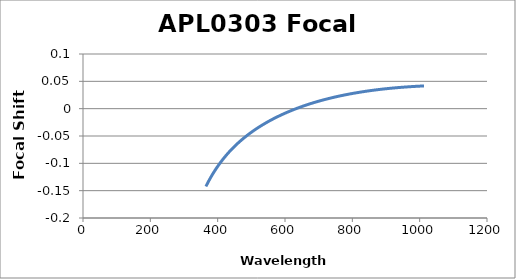
| Category | Focal Shift (mm) |
|---|---|
| 365.0 | -0.142 |
| 366.0 | -0.141 |
| 367.0 | -0.14 |
| 368.0 | -0.139 |
| 369.0 | -0.137 |
| 370.0 | -0.136 |
| 371.0 | -0.135 |
| 372.0 | -0.134 |
| 373.0 | -0.133 |
| 374.0 | -0.132 |
| 375.0 | -0.131 |
| 376.0 | -0.129 |
| 377.0 | -0.128 |
| 378.0 | -0.127 |
| 379.0 | -0.126 |
| 380.0 | -0.125 |
| 381.0 | -0.124 |
| 382.0 | -0.123 |
| 383.0 | -0.122 |
| 384.0 | -0.121 |
| 385.0 | -0.12 |
| 386.0 | -0.119 |
| 387.0 | -0.118 |
| 388.0 | -0.117 |
| 389.0 | -0.116 |
| 390.0 | -0.115 |
| 391.0 | -0.114 |
| 392.0 | -0.113 |
| 393.0 | -0.112 |
| 394.0 | -0.111 |
| 395.0 | -0.11 |
| 396.0 | -0.109 |
| 397.0 | -0.108 |
| 398.0 | -0.107 |
| 399.0 | -0.107 |
| 400.0 | -0.106 |
| 401.0 | -0.105 |
| 402.0 | -0.104 |
| 403.0 | -0.103 |
| 404.0 | -0.102 |
| 405.0 | -0.101 |
| 406.0 | -0.1 |
| 407.0 | -0.1 |
| 408.0 | -0.099 |
| 409.0 | -0.098 |
| 410.0 | -0.097 |
| 411.0 | -0.096 |
| 412.0 | -0.095 |
| 413.0 | -0.095 |
| 414.0 | -0.094 |
| 415.0 | -0.093 |
| 416.0 | -0.092 |
| 417.0 | -0.092 |
| 418.0 | -0.091 |
| 419.0 | -0.09 |
| 420.0 | -0.089 |
| 421.0 | -0.089 |
| 422.0 | -0.088 |
| 423.0 | -0.087 |
| 424.0 | -0.086 |
| 425.0 | -0.086 |
| 426.0 | -0.085 |
| 427.0 | -0.084 |
| 428.0 | -0.083 |
| 429.0 | -0.083 |
| 430.0 | -0.082 |
| 431.0 | -0.081 |
| 432.0 | -0.081 |
| 433.0 | -0.08 |
| 434.0 | -0.079 |
| 435.0 | -0.079 |
| 436.0 | -0.078 |
| 437.0 | -0.077 |
| 438.0 | -0.077 |
| 439.0 | -0.076 |
| 440.0 | -0.075 |
| 441.0 | -0.075 |
| 442.0 | -0.074 |
| 443.0 | -0.073 |
| 444.0 | -0.073 |
| 445.0 | -0.072 |
| 446.0 | -0.072 |
| 447.0 | -0.071 |
| 448.0 | -0.07 |
| 449.0 | -0.07 |
| 450.0 | -0.069 |
| 451.0 | -0.068 |
| 452.0 | -0.068 |
| 453.0 | -0.067 |
| 454.0 | -0.067 |
| 455.0 | -0.066 |
| 456.0 | -0.066 |
| 457.0 | -0.065 |
| 458.0 | -0.064 |
| 459.0 | -0.064 |
| 460.0 | -0.063 |
| 461.0 | -0.063 |
| 462.0 | -0.062 |
| 463.0 | -0.062 |
| 464.0 | -0.061 |
| 465.0 | -0.06 |
| 466.0 | -0.06 |
| 467.0 | -0.059 |
| 468.0 | -0.059 |
| 469.0 | -0.058 |
| 470.0 | -0.058 |
| 471.0 | -0.057 |
| 472.0 | -0.057 |
| 473.0 | -0.056 |
| 474.0 | -0.056 |
| 475.0 | -0.055 |
| 476.0 | -0.055 |
| 477.0 | -0.054 |
| 478.0 | -0.054 |
| 479.0 | -0.053 |
| 480.0 | -0.053 |
| 481.0 | -0.052 |
| 482.0 | -0.052 |
| 483.0 | -0.051 |
| 484.0 | -0.051 |
| 485.0 | -0.05 |
| 486.0 | -0.05 |
| 487.0 | -0.049 |
| 488.0 | -0.049 |
| 489.0 | -0.048 |
| 490.0 | -0.048 |
| 491.0 | -0.047 |
| 492.0 | -0.047 |
| 493.0 | -0.046 |
| 494.0 | -0.046 |
| 495.0 | -0.045 |
| 496.0 | -0.045 |
| 497.0 | -0.045 |
| 498.0 | -0.044 |
| 499.0 | -0.044 |
| 500.0 | -0.043 |
| 501.0 | -0.043 |
| 502.0 | -0.042 |
| 503.0 | -0.042 |
| 504.0 | -0.041 |
| 505.0 | -0.041 |
| 506.0 | -0.041 |
| 507.0 | -0.04 |
| 508.0 | -0.04 |
| 509.0 | -0.039 |
| 510.0 | -0.039 |
| 511.0 | -0.038 |
| 512.0 | -0.038 |
| 513.0 | -0.038 |
| 514.0 | -0.037 |
| 515.0 | -0.037 |
| 516.0 | -0.036 |
| 517.0 | -0.036 |
| 518.0 | -0.036 |
| 519.0 | -0.035 |
| 520.0 | -0.035 |
| 521.0 | -0.034 |
| 522.0 | -0.034 |
| 523.0 | -0.034 |
| 524.0 | -0.033 |
| 525.0 | -0.033 |
| 526.0 | -0.032 |
| 527.0 | -0.032 |
| 528.0 | -0.032 |
| 529.0 | -0.031 |
| 530.0 | -0.031 |
| 531.0 | -0.031 |
| 532.0 | -0.03 |
| 533.0 | -0.03 |
| 534.0 | -0.029 |
| 535.0 | -0.029 |
| 536.0 | -0.029 |
| 537.0 | -0.028 |
| 538.0 | -0.028 |
| 539.0 | -0.028 |
| 540.0 | -0.027 |
| 541.0 | -0.027 |
| 542.0 | -0.026 |
| 543.0 | -0.026 |
| 544.0 | -0.026 |
| 545.0 | -0.025 |
| 546.0 | -0.025 |
| 547.0 | -0.025 |
| 548.0 | -0.024 |
| 549.0 | -0.024 |
| 550.0 | -0.024 |
| 551.0 | -0.023 |
| 552.0 | -0.023 |
| 553.0 | -0.023 |
| 554.0 | -0.022 |
| 555.0 | -0.022 |
| 556.0 | -0.022 |
| 557.0 | -0.021 |
| 558.0 | -0.021 |
| 559.0 | -0.021 |
| 560.0 | -0.02 |
| 561.0 | -0.02 |
| 562.0 | -0.02 |
| 563.0 | -0.019 |
| 564.0 | -0.019 |
| 565.0 | -0.019 |
| 566.0 | -0.018 |
| 567.0 | -0.018 |
| 568.0 | -0.018 |
| 569.0 | -0.017 |
| 570.0 | -0.017 |
| 571.0 | -0.017 |
| 572.0 | -0.016 |
| 573.0 | -0.016 |
| 574.0 | -0.016 |
| 575.0 | -0.016 |
| 576.0 | -0.015 |
| 577.0 | -0.015 |
| 578.0 | -0.015 |
| 579.0 | -0.014 |
| 580.0 | -0.014 |
| 581.0 | -0.014 |
| 582.0 | -0.013 |
| 583.0 | -0.013 |
| 584.0 | -0.013 |
| 585.0 | -0.013 |
| 586.0 | -0.012 |
| 587.0 | -0.012 |
| 588.0 | -0.012 |
| 589.0 | -0.011 |
| 590.0 | -0.011 |
| 591.0 | -0.011 |
| 592.0 | -0.011 |
| 593.0 | -0.01 |
| 594.0 | -0.01 |
| 595.0 | -0.01 |
| 596.0 | -0.009 |
| 597.0 | -0.009 |
| 598.0 | -0.009 |
| 599.0 | -0.009 |
| 600.0 | -0.008 |
| 601.0 | -0.008 |
| 602.0 | -0.008 |
| 603.0 | -0.008 |
| 604.0 | -0.007 |
| 605.0 | -0.007 |
| 606.0 | -0.007 |
| 607.0 | -0.006 |
| 608.0 | -0.006 |
| 609.0 | -0.006 |
| 610.0 | -0.006 |
| 611.0 | -0.005 |
| 612.0 | -0.005 |
| 613.0 | -0.005 |
| 614.0 | -0.005 |
| 615.0 | -0.004 |
| 616.0 | -0.004 |
| 617.0 | -0.004 |
| 618.0 | -0.004 |
| 619.0 | -0.003 |
| 620.0 | -0.003 |
| 621.0 | -0.003 |
| 622.0 | -0.003 |
| 623.0 | -0.002 |
| 624.0 | -0.002 |
| 625.0 | -0.002 |
| 626.0 | -0.002 |
| 627.0 | -0.001 |
| 628.0 | -0.001 |
| 629.0 | -0.001 |
| 630.0 | -0.001 |
| 631.0 | 0 |
| 632.0 | 0 |
| 633.0 | 0 |
| 634.0 | 0 |
| 635.0 | 0 |
| 636.0 | 0.001 |
| 637.0 | 0.001 |
| 638.0 | 0.001 |
| 639.0 | 0.001 |
| 640.0 | 0.002 |
| 641.0 | 0.002 |
| 642.0 | 0.002 |
| 643.0 | 0.002 |
| 644.0 | 0.003 |
| 645.0 | 0.003 |
| 646.0 | 0.003 |
| 647.0 | 0.003 |
| 648.0 | 0.003 |
| 649.0 | 0.004 |
| 650.0 | 0.004 |
| 651.0 | 0.004 |
| 652.0 | 0.004 |
| 653.0 | 0.005 |
| 654.0 | 0.005 |
| 655.0 | 0.005 |
| 656.0 | 0.005 |
| 657.0 | 0.005 |
| 658.0 | 0.006 |
| 659.0 | 0.006 |
| 660.0 | 0.006 |
| 661.0 | 0.006 |
| 662.0 | 0.006 |
| 663.0 | 0.007 |
| 664.0 | 0.007 |
| 665.0 | 0.007 |
| 666.0 | 0.007 |
| 667.0 | 0.007 |
| 668.0 | 0.008 |
| 669.0 | 0.008 |
| 670.0 | 0.008 |
| 671.0 | 0.008 |
| 672.0 | 0.008 |
| 673.0 | 0.009 |
| 674.0 | 0.009 |
| 675.0 | 0.009 |
| 676.0 | 0.009 |
| 677.0 | 0.009 |
| 678.0 | 0.01 |
| 679.0 | 0.01 |
| 680.0 | 0.01 |
| 681.0 | 0.01 |
| 682.0 | 0.01 |
| 683.0 | 0.011 |
| 684.0 | 0.011 |
| 685.0 | 0.011 |
| 686.0 | 0.011 |
| 687.0 | 0.011 |
| 688.0 | 0.011 |
| 689.0 | 0.012 |
| 690.0 | 0.012 |
| 691.0 | 0.012 |
| 692.0 | 0.012 |
| 693.0 | 0.012 |
| 694.0 | 0.013 |
| 695.0 | 0.013 |
| 696.0 | 0.013 |
| 697.0 | 0.013 |
| 698.0 | 0.013 |
| 699.0 | 0.013 |
| 700.0 | 0.014 |
| 701.0 | 0.014 |
| 702.0 | 0.014 |
| 703.0 | 0.014 |
| 704.0 | 0.014 |
| 705.0 | 0.015 |
| 706.0 | 0.015 |
| 707.0 | 0.015 |
| 708.0 | 0.015 |
| 709.0 | 0.015 |
| 710.0 | 0.015 |
| 711.0 | 0.016 |
| 712.0 | 0.016 |
| 713.0 | 0.016 |
| 714.0 | 0.016 |
| 715.0 | 0.016 |
| 716.0 | 0.016 |
| 717.0 | 0.017 |
| 718.0 | 0.017 |
| 719.0 | 0.017 |
| 720.0 | 0.017 |
| 721.0 | 0.017 |
| 722.0 | 0.017 |
| 723.0 | 0.017 |
| 724.0 | 0.018 |
| 725.0 | 0.018 |
| 726.0 | 0.018 |
| 727.0 | 0.018 |
| 728.0 | 0.018 |
| 729.0 | 0.018 |
| 730.0 | 0.019 |
| 731.0 | 0.019 |
| 732.0 | 0.019 |
| 733.0 | 0.019 |
| 734.0 | 0.019 |
| 735.0 | 0.019 |
| 736.0 | 0.019 |
| 737.0 | 0.02 |
| 738.0 | 0.02 |
| 739.0 | 0.02 |
| 740.0 | 0.02 |
| 741.0 | 0.02 |
| 742.0 | 0.02 |
| 743.0 | 0.021 |
| 744.0 | 0.021 |
| 745.0 | 0.021 |
| 746.0 | 0.021 |
| 747.0 | 0.021 |
| 748.0 | 0.021 |
| 749.0 | 0.021 |
| 750.0 | 0.022 |
| 751.0 | 0.022 |
| 752.0 | 0.022 |
| 753.0 | 0.022 |
| 754.0 | 0.022 |
| 755.0 | 0.022 |
| 756.0 | 0.022 |
| 757.0 | 0.022 |
| 758.0 | 0.023 |
| 759.0 | 0.023 |
| 760.0 | 0.023 |
| 761.0 | 0.023 |
| 762.0 | 0.023 |
| 763.0 | 0.023 |
| 764.0 | 0.023 |
| 765.0 | 0.024 |
| 766.0 | 0.024 |
| 767.0 | 0.024 |
| 768.0 | 0.024 |
| 769.0 | 0.024 |
| 770.0 | 0.024 |
| 771.0 | 0.024 |
| 772.0 | 0.024 |
| 773.0 | 0.025 |
| 774.0 | 0.025 |
| 775.0 | 0.025 |
| 776.0 | 0.025 |
| 777.0 | 0.025 |
| 778.0 | 0.025 |
| 779.0 | 0.025 |
| 780.0 | 0.025 |
| 781.0 | 0.026 |
| 782.0 | 0.026 |
| 783.0 | 0.026 |
| 784.0 | 0.026 |
| 785.0 | 0.026 |
| 786.0 | 0.026 |
| 787.0 | 0.026 |
| 788.0 | 0.026 |
| 789.0 | 0.027 |
| 790.0 | 0.027 |
| 791.0 | 0.027 |
| 792.0 | 0.027 |
| 793.0 | 0.027 |
| 794.0 | 0.027 |
| 795.0 | 0.027 |
| 796.0 | 0.027 |
| 797.0 | 0.027 |
| 798.0 | 0.028 |
| 799.0 | 0.028 |
| 800.0 | 0.028 |
| 801.0 | 0.028 |
| 802.0 | 0.028 |
| 803.0 | 0.028 |
| 804.0 | 0.028 |
| 805.0 | 0.028 |
| 806.0 | 0.028 |
| 807.0 | 0.029 |
| 808.0 | 0.029 |
| 809.0 | 0.029 |
| 810.0 | 0.029 |
| 811.0 | 0.029 |
| 812.0 | 0.029 |
| 813.0 | 0.029 |
| 814.0 | 0.029 |
| 815.0 | 0.029 |
| 816.0 | 0.029 |
| 817.0 | 0.03 |
| 818.0 | 0.03 |
| 819.0 | 0.03 |
| 820.0 | 0.03 |
| 821.0 | 0.03 |
| 822.0 | 0.03 |
| 823.0 | 0.03 |
| 824.0 | 0.03 |
| 825.0 | 0.03 |
| 826.0 | 0.03 |
| 827.0 | 0.031 |
| 828.0 | 0.031 |
| 829.0 | 0.031 |
| 830.0 | 0.031 |
| 831.0 | 0.031 |
| 832.0 | 0.031 |
| 833.0 | 0.031 |
| 834.0 | 0.031 |
| 835.0 | 0.031 |
| 836.0 | 0.031 |
| 837.0 | 0.032 |
| 838.0 | 0.032 |
| 839.0 | 0.032 |
| 840.0 | 0.032 |
| 841.0 | 0.032 |
| 842.0 | 0.032 |
| 843.0 | 0.032 |
| 844.0 | 0.032 |
| 845.0 | 0.032 |
| 846.0 | 0.032 |
| 847.0 | 0.032 |
| 848.0 | 0.033 |
| 849.0 | 0.033 |
| 850.0 | 0.033 |
| 851.0 | 0.033 |
| 852.0 | 0.033 |
| 853.0 | 0.033 |
| 854.0 | 0.033 |
| 855.0 | 0.033 |
| 856.0 | 0.033 |
| 857.0 | 0.033 |
| 858.0 | 0.033 |
| 859.0 | 0.033 |
| 860.0 | 0.034 |
| 861.0 | 0.034 |
| 862.0 | 0.034 |
| 863.0 | 0.034 |
| 864.0 | 0.034 |
| 865.0 | 0.034 |
| 866.0 | 0.034 |
| 867.0 | 0.034 |
| 868.0 | 0.034 |
| 869.0 | 0.034 |
| 870.0 | 0.034 |
| 871.0 | 0.034 |
| 872.0 | 0.034 |
| 873.0 | 0.035 |
| 874.0 | 0.035 |
| 875.0 | 0.035 |
| 876.0 | 0.035 |
| 877.0 | 0.035 |
| 878.0 | 0.035 |
| 879.0 | 0.035 |
| 880.0 | 0.035 |
| 881.0 | 0.035 |
| 882.0 | 0.035 |
| 883.0 | 0.035 |
| 884.0 | 0.035 |
| 885.0 | 0.035 |
| 886.0 | 0.036 |
| 887.0 | 0.036 |
| 888.0 | 0.036 |
| 889.0 | 0.036 |
| 890.0 | 0.036 |
| 891.0 | 0.036 |
| 892.0 | 0.036 |
| 893.0 | 0.036 |
| 894.0 | 0.036 |
| 895.0 | 0.036 |
| 896.0 | 0.036 |
| 897.0 | 0.036 |
| 898.0 | 0.036 |
| 899.0 | 0.036 |
| 900.0 | 0.036 |
| 901.0 | 0.037 |
| 902.0 | 0.037 |
| 903.0 | 0.037 |
| 904.0 | 0.037 |
| 905.0 | 0.037 |
| 906.0 | 0.037 |
| 907.0 | 0.037 |
| 908.0 | 0.037 |
| 909.0 | 0.037 |
| 910.0 | 0.037 |
| 911.0 | 0.037 |
| 912.0 | 0.037 |
| 913.0 | 0.037 |
| 914.0 | 0.037 |
| 915.0 | 0.037 |
| 916.0 | 0.037 |
| 917.0 | 0.038 |
| 918.0 | 0.038 |
| 919.0 | 0.038 |
| 920.0 | 0.038 |
| 921.0 | 0.038 |
| 922.0 | 0.038 |
| 923.0 | 0.038 |
| 924.0 | 0.038 |
| 925.0 | 0.038 |
| 926.0 | 0.038 |
| 927.0 | 0.038 |
| 928.0 | 0.038 |
| 929.0 | 0.038 |
| 930.0 | 0.038 |
| 931.0 | 0.038 |
| 932.0 | 0.038 |
| 933.0 | 0.038 |
| 934.0 | 0.038 |
| 935.0 | 0.039 |
| 936.0 | 0.039 |
| 937.0 | 0.039 |
| 938.0 | 0.039 |
| 939.0 | 0.039 |
| 940.0 | 0.039 |
| 941.0 | 0.039 |
| 942.0 | 0.039 |
| 943.0 | 0.039 |
| 944.0 | 0.039 |
| 945.0 | 0.039 |
| 946.0 | 0.039 |
| 947.0 | 0.039 |
| 948.0 | 0.039 |
| 949.0 | 0.039 |
| 950.0 | 0.039 |
| 951.0 | 0.039 |
| 952.0 | 0.039 |
| 953.0 | 0.039 |
| 954.0 | 0.039 |
| 955.0 | 0.039 |
| 956.0 | 0.04 |
| 957.0 | 0.04 |
| 958.0 | 0.04 |
| 959.0 | 0.04 |
| 960.0 | 0.04 |
| 961.0 | 0.04 |
| 962.0 | 0.04 |
| 963.0 | 0.04 |
| 964.0 | 0.04 |
| 965.0 | 0.04 |
| 966.0 | 0.04 |
| 967.0 | 0.04 |
| 968.0 | 0.04 |
| 969.0 | 0.04 |
| 970.0 | 0.04 |
| 971.0 | 0.04 |
| 972.0 | 0.04 |
| 973.0 | 0.04 |
| 974.0 | 0.04 |
| 975.0 | 0.04 |
| 976.0 | 0.04 |
| 977.0 | 0.04 |
| 978.0 | 0.04 |
| 979.0 | 0.04 |
| 980.0 | 0.041 |
| 981.0 | 0.041 |
| 982.0 | 0.041 |
| 983.0 | 0.041 |
| 984.0 | 0.041 |
| 985.0 | 0.041 |
| 986.0 | 0.041 |
| 987.0 | 0.041 |
| 988.0 | 0.041 |
| 989.0 | 0.041 |
| 990.0 | 0.041 |
| 991.0 | 0.041 |
| 992.0 | 0.041 |
| 993.0 | 0.041 |
| 994.0 | 0.041 |
| 995.0 | 0.041 |
| 996.0 | 0.041 |
| 997.0 | 0.041 |
| 998.0 | 0.041 |
| 999.0 | 0.041 |
| 1000.0 | 0.041 |
| 1001.0 | 0.041 |
| 1002.0 | 0.041 |
| 1003.0 | 0.041 |
| 1004.0 | 0.041 |
| 1005.0 | 0.041 |
| 1006.0 | 0.041 |
| 1007.0 | 0.041 |
| 1008.0 | 0.041 |
| 1009.0 | 0.041 |
| 1010.0 | 0.041 |
| 1011.0 | 0.042 |
| 1012.0 | 0.042 |
| 1013.0 | 0.042 |